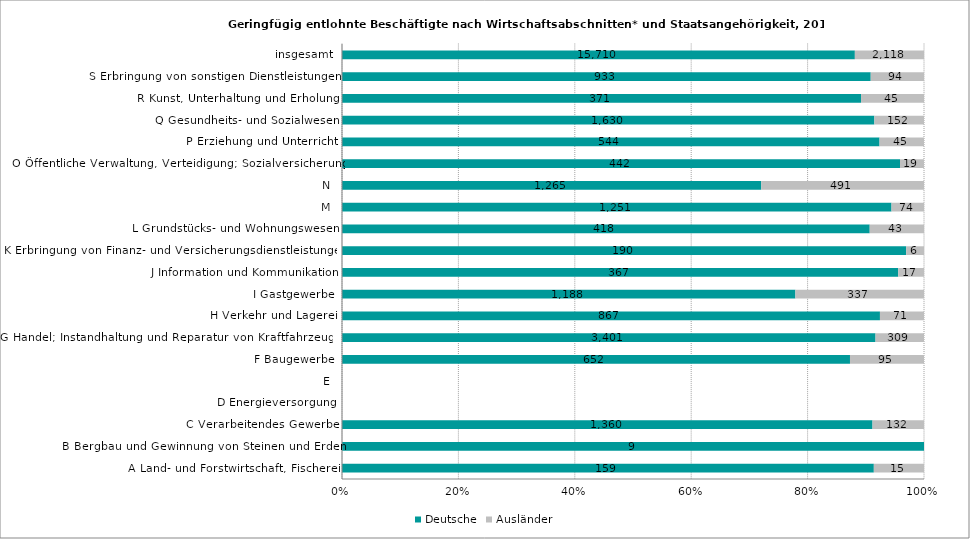
| Category | Deutsche | Ausländer |
|---|---|---|
| A Land- und Forstwirtschaft, Fischerei | 159 | 15 |
| B Bergbau und Gewinnung von Steinen und Erden | 9 | 0 |
| C Verarbeitendes Gewerbe | 1360 | 132 |
| D Energieversorgung | 0 | 0 |
| E | 0 | 0 |
| F Baugewerbe | 652 | 95 |
| G Handel; Instandhaltung und Reparatur von Kraftfahrzeugen | 3401 | 309 |
| H Verkehr und Lagerei | 867 | 71 |
| I Gastgewerbe | 1188 | 337 |
| J Information und Kommunikation | 367 | 17 |
| K Erbringung von Finanz- und Versicherungsdienstleistungen | 190 | 6 |
| L Grundstücks- und Wohnungswesen | 418 | 43 |
| M | 1251 | 74 |
| N | 1265 | 491 |
| O Öffentliche Verwaltung, Verteidigung; Sozialversicherung | 442 | 19 |
| P Erziehung und Unterricht | 544 | 45 |
| Q Gesundheits- und Sozialwesen | 1630 | 152 |
| R Kunst, Unterhaltung und Erholung | 371 | 45 |
| S Erbringung von sonstigen Dienstleistungen | 933 | 94 |
| insgesamt | 15710 | 2118 |